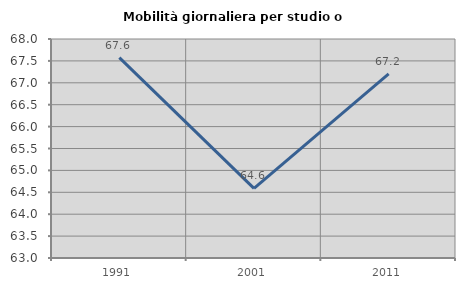
| Category | Mobilità giornaliera per studio o lavoro |
|---|---|
| 1991.0 | 67.573 |
| 2001.0 | 64.591 |
| 2011.0 | 67.203 |